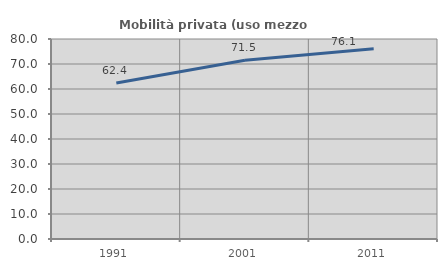
| Category | Mobilità privata (uso mezzo privato) |
|---|---|
| 1991.0 | 62.367 |
| 2001.0 | 71.505 |
| 2011.0 | 76.07 |